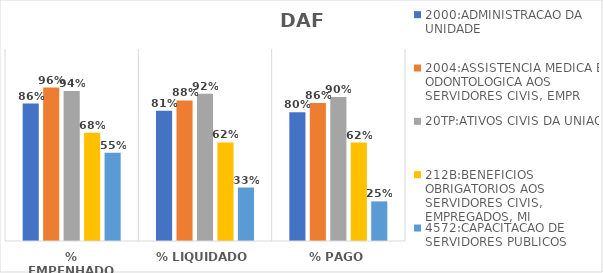
| Category | 2000:ADMINISTRACAO DA UNIDADE | 2004:ASSISTENCIA MEDICA E ODONTOLOGICA AOS SERVIDORES CIVIS, EMPR | 20TP:ATIVOS CIVIS DA UNIAO | 212B:BENEFICIOS OBRIGATORIOS AOS SERVIDORES CIVIS, EMPREGADOS, MI | 4572:CAPACITACAO DE SERVIDORES PUBLICOS FEDERAIS EM PROCESSO DE Q |
|---|---|---|---|---|---|
| % EMPENHADO | 0.859 | 0.959 | 0.938 | 0.677 | 0.551 |
| % LIQUIDADO | 0.814 | 0.879 | 0.92 | 0.616 | 0.334 |
| % PAGO | 0.805 | 0.863 | 0.9 | 0.615 | 0.248 |